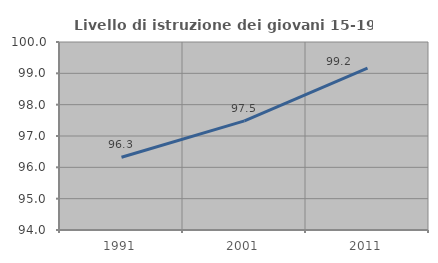
| Category | Livello di istruzione dei giovani 15-19 anni |
|---|---|
| 1991.0 | 96.321 |
| 2001.0 | 97.482 |
| 2011.0 | 99.169 |